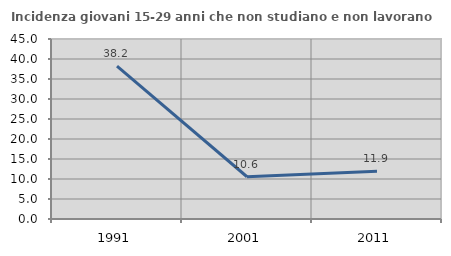
| Category | Incidenza giovani 15-29 anni che non studiano e non lavorano  |
|---|---|
| 1991.0 | 38.208 |
| 2001.0 | 10.562 |
| 2011.0 | 11.912 |